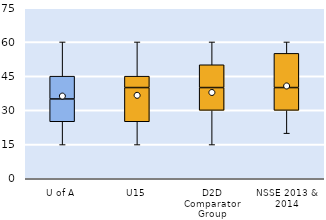
| Category | 25th | 50th | 75th |
|---|---|---|---|
| U of A | 25 | 10 | 10 |
| U15 | 25 | 15 | 5 |
| D2D Comparator Group | 30 | 10 | 10 |
| NSSE 2013 & 2014 | 30 | 10 | 15 |